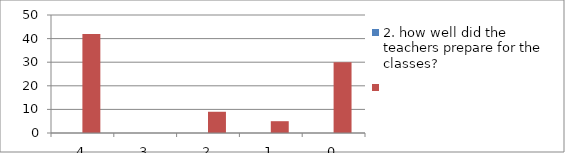
| Category | 2. how well did the teachers prepare for the classes? | Series 1 |
|---|---|---|
| 4.0 | 0 | 42 |
| 3.0 | 0 | 0 |
| 2.0 | 0 | 9 |
| 1.0 | 0 | 5 |
| 0.0 | 0 | 30 |